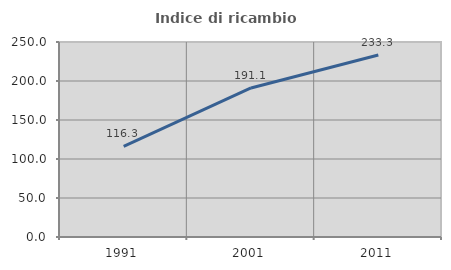
| Category | Indice di ricambio occupazionale  |
|---|---|
| 1991.0 | 116.327 |
| 2001.0 | 191.111 |
| 2011.0 | 233.333 |